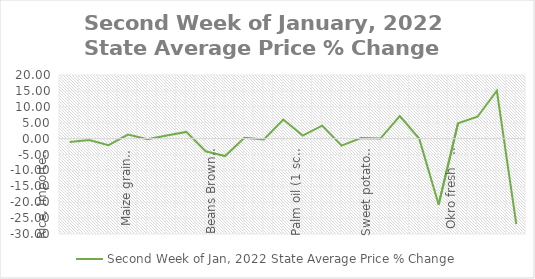
| Category | Second Week of Jan, 2022 |
|---|---|
| Rice, Imported, High Quality Sold loose  (1 mudu) | -1.064 |
| Rice, Agric Sold Loose(Low quality) imported  (1 mudu) | -0.472 |
| Rice Local, Sold Loose   (1 mudu) | -2.088 |
| Maize grain, white sold loose   (1 mudu) | 1.259 |
| Maize grain, yellow sold loose   (1 mudu) | -0.208 |
| Sorghum (Guinea Corn) white or brown, sold loose   (1 mudu) | 0.995 |
| millet (jero or maiwa) sold loose   (1 mudu) | 2.103 |
| Beans: white black eye. Sold loose   (1 mudu) | -3.972 |
| Beans Brown, sold loose  (1 mudu) | -5.484 |
| Soya Beans, sold loose    (1 mudu) | 0.283 |
| Gari White, sold loose  (1 mudu) | -0.279 |
| Gari Yellow, sold loose   (1 mudu) | 5.983 |
| Palm oil (1 schnap bottle) | 0.958 |
| Yam tuber (1 Medium Size) | 4.082 |
| Cassava tuber | -2.198 |
| Irish potato  (4 Litre rubber) | 0.159 |
| Sweet potato  (5 Medium Size) | 0 |
| Local live chicken  | 7.08 |
| Groundnut - shelled (fresh) | 0 |
| Tomato fresh   (4 Litre rubber) | -20.712 |
| Okro fresh     (1 mudu) | 4.797 |
| Okro dried    (1 mudu) | 6.87 |
| Onion   (4 Litre rubber) | 15.049 |
| Pepper fresh   (4 Litre rubber) | -26.872 |